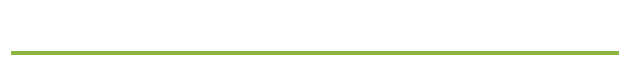
| Category | Transportation |
|---|---|
| 0 | 0 |